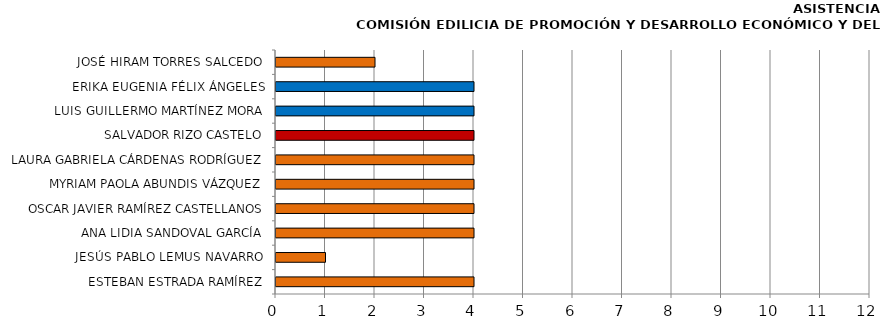
| Category | Series 0 |
|---|---|
| ESTEBAN ESTRADA RAMÍREZ | 4 |
| JESÚS PABLO LEMUS NAVARRO | 1 |
| ANA LIDIA SANDOVAL GARCÍA | 4 |
| OSCAR JAVIER RAMÍREZ CASTELLANOS | 4 |
| MYRIAM PAOLA ABUNDIS VÁZQUEZ | 4 |
| LAURA GABRIELA CÁRDENAS RODRÍGUEZ | 4 |
| SALVADOR RIZO CASTELO | 4 |
| LUIS GUILLERMO MARTÍNEZ MORA | 4 |
| ERIKA EUGENIA FÉLIX ÁNGELES | 4 |
| JOSÉ HIRAM TORRES SALCEDO | 2 |